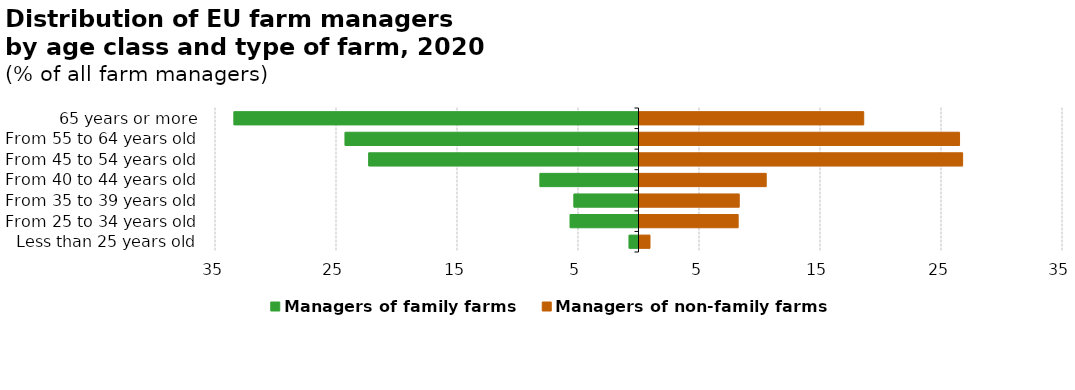
| Category | Managers of family farms | Managers of non-family farms |
|---|---|---|
| 65 years or more | -33.467 | 18.614 |
| From 55 to 64 years old | -24.284 | 26.534 |
| From 45 to 54 years old | -22.333 | 26.787 |
| From 40 to 44 years old | -8.177 | 10.555 |
| From 35 to 39 years old | -5.372 | 8.326 |
| From 25 to 34 years old | -5.684 | 8.236 |
| Less than 25 years old | -0.813 | 0.948 |